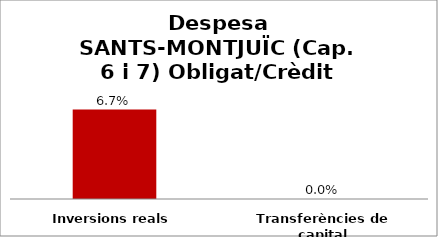
| Category | Series 0 |
|---|---|
| Inversions reals | 0.067 |
| Transferències de capital | 0 |